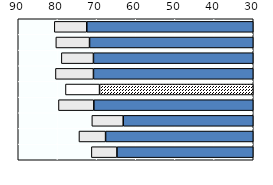
| Category | Series 1 | Series 0 |
|---|---|---|
| 0 | 72.5 | 8.29 |
| 1 | 71.8 | 8.6 |
| 2 | 70.8 | 8.19 |
| 3 | 70.8 | 9.7 |
| 4 | 69.24 | 8.703 |
| 5 | 70.7 | 9.03 |
| 6 | 63.2 | 8.007 |
| 7 | 67.7 | 6.8 |
| 8 | 64.8 | 6.529 |